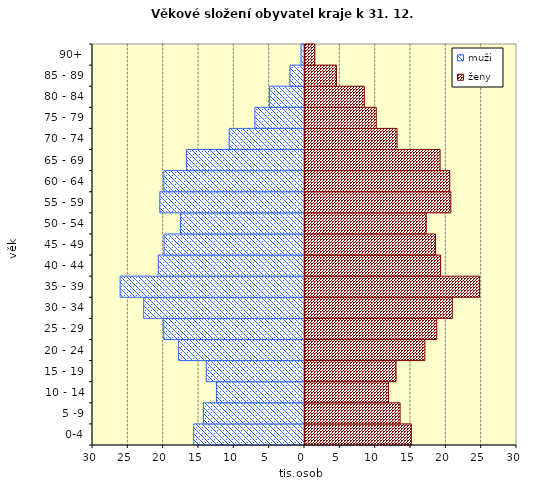
| Category | muži | ženy |
|---|---|---|
| 0-4 | -15668 | 15192 |
|  5 -9 | -14302 | 13598 |
|  10 - 14 | -12459 | 11952 |
| 15 - 19 | -13901 | 13025 |
| 20 - 24 | -17815 | 17108 |
| 25 - 29 | -19914 | 18783 |
| 30 - 34 | -22757 | 20985 |
| 35 - 39 | -26087 | 24841 |
| 40 - 44 | -20692 | 19331 |
| 45 - 49 | -19861 | 18611 |
| 50 - 54 | -17547 | 17295 |
| 55 - 59 | -20477 | 20779 |
| 60 - 64 | -19901 | 20627 |
| 65 - 69 | -16703 | 19257 |
| 70 - 74 | -10661 | 13169 |
| 75 - 79 | -7021 | 10226 |
| 80 - 84 | -4935 | 8533 |
| 85 - 89 | -2051 | 4590 |
| 90+ | -498 | 1535 |